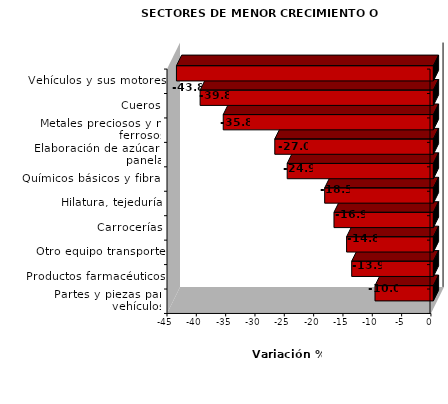
| Category | Series 0 |
|---|---|
| Vehículos y sus motores | -43.808 |
| Cueros | -39.772 |
| Metales preciosos y no ferrosos | -35.828 |
| Elaboración de azúcar y panela | -27.041 |
| Químicos básicos y fibras | -24.926 |
| Hilatura, tejeduría | -18.537 |
| Carrocerías | -16.948 |
| Otro equipo transporte | -14.799 |
| Productos farmacéuticos | -13.928 |
| Partes y piezas para vehículos | -9.957 |